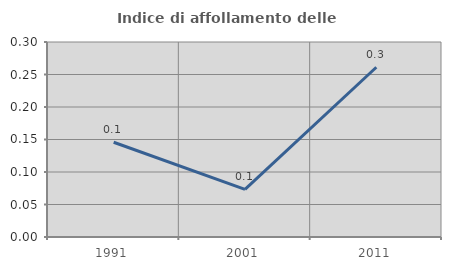
| Category | Indice di affollamento delle abitazioni  |
|---|---|
| 1991.0 | 0.146 |
| 2001.0 | 0.073 |
| 2011.0 | 0.261 |